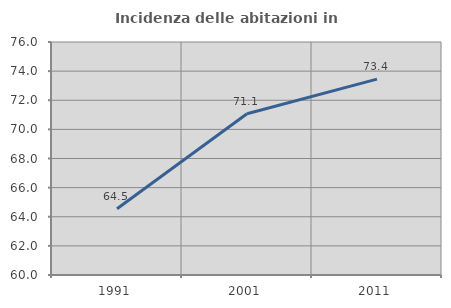
| Category | Incidenza delle abitazioni in proprietà  |
|---|---|
| 1991.0 | 64.545 |
| 2001.0 | 71.076 |
| 2011.0 | 73.45 |